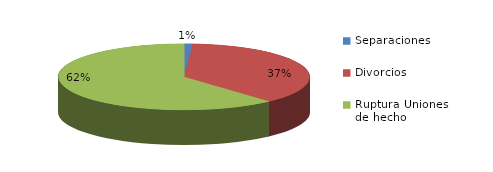
| Category | Series 0 |
|---|---|
| Separaciones | 45 |
| Divorcios | 1548 |
| Ruptura Uniones de hecho | 2570 |